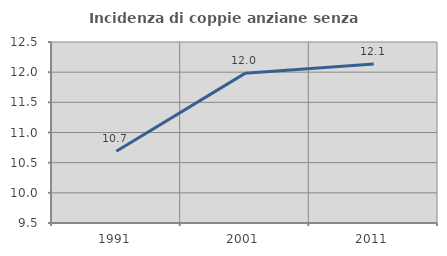
| Category | Incidenza di coppie anziane senza figli  |
|---|---|
| 1991.0 | 10.691 |
| 2001.0 | 11.98 |
| 2011.0 | 12.136 |